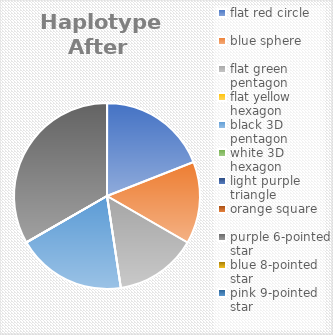
| Category | Series 4 | Series 5 | Series 6 | Series 7 | Series 2 | Series 3 | Series 1 | Series 0 |
|---|---|---|---|---|---|---|---|---|
| flat red circle | 4 | 26 | 15 | 26 | 15 | 26 | 15 | 26 |
| blue sphere | 3 | 24 | 19 | 24 | 19 | 24 | 19 | 24 |
| flat green pentagon | 3 | 13 | 3 | 13 | 3 | 13 | 3 | 13 |
| flat yellow hexagon | 0 | 13 | 13 | 13 | 13 | 13 | 13 | 13 |
| black 3D pentagon | 4 | 10 | 4 | 10 | 4 | 10 | 4 | 10 |
| white 3D hexagon | 0 | 14 | 14 | 14 | 14 | 14 | 14 | 14 |
| light purple triangle | 0 | 7 | 7 | 7 | 7 | 7 | 7 | 7 |
| orange square | 0 | 4 | 0 | 4 | 0 | 4 | 0 | 4 |
| purple 6-pointed star | 7 | 16 | 16 | 16 | 16 | 16 | 16 | 16 |
| blue 8-pointed star | 0 | 12 | 0 | 12 | 0 | 12 | 0 | 12 |
| pink 9-pointed star | 0 | 11 | 11 | 11 | 11 | 11 | 11 | 11 |